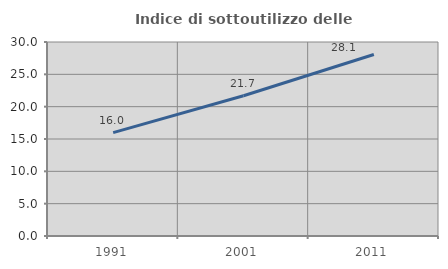
| Category | Indice di sottoutilizzo delle abitazioni  |
|---|---|
| 1991.0 | 15.993 |
| 2001.0 | 21.687 |
| 2011.0 | 28.067 |